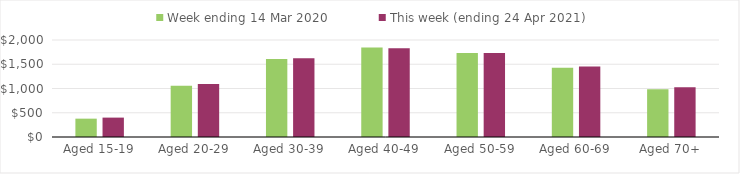
| Category | Week ending 14 Mar 2020 | This week (ending 24 Apr 2021) |
|---|---|---|
| Aged 15-19 | 378.16 | 399.76 |
| Aged 20-29 | 1055.45 | 1092.84 |
| Aged 30-39 | 1610.53 | 1623.57 |
| Aged 40-49 | 1847.13 | 1832.05 |
| Aged 50-59 | 1732.69 | 1732.94 |
| Aged 60-69 | 1428.84 | 1452.09 |
| Aged 70+ | 982.93 | 1023.4 |